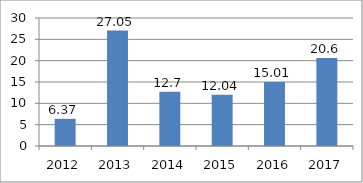
| Category | Series 0 |
|---|---|
| 2012.0 | 6.37 |
| 2013.0 | 27.05 |
| 2014.0 | 12.7 |
| 2015.0 | 12.04 |
| 2016.0 | 15.01 |
| 2017.0 | 20.6 |